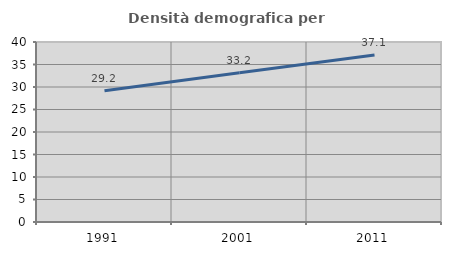
| Category | Densità demografica |
|---|---|
| 1991.0 | 29.157 |
| 2001.0 | 33.163 |
| 2011.0 | 37.086 |